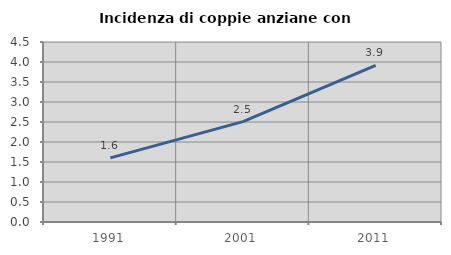
| Category | Incidenza di coppie anziane con figli |
|---|---|
| 1991.0 | 1.603 |
| 2001.0 | 2.511 |
| 2011.0 | 3.915 |